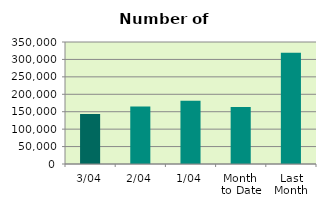
| Category | Series 0 |
|---|---|
| 3/04 | 143206 |
| 2/04 | 165236 |
| 1/04 | 181176 |
| Month 
to Date | 163206 |
| Last
Month | 318803.545 |